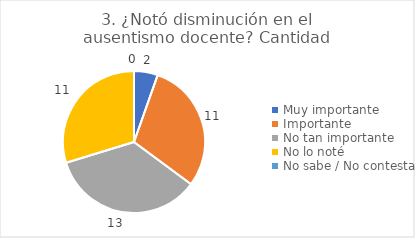
| Category | 3. ¿Notó disminución en el ausentismo docente? |
|---|---|
| Muy importante  | 0.054 |
| Importante  | 0.297 |
| No tan importante  | 0.351 |
| No lo noté  | 0.297 |
| No sabe / No contesta | 0 |